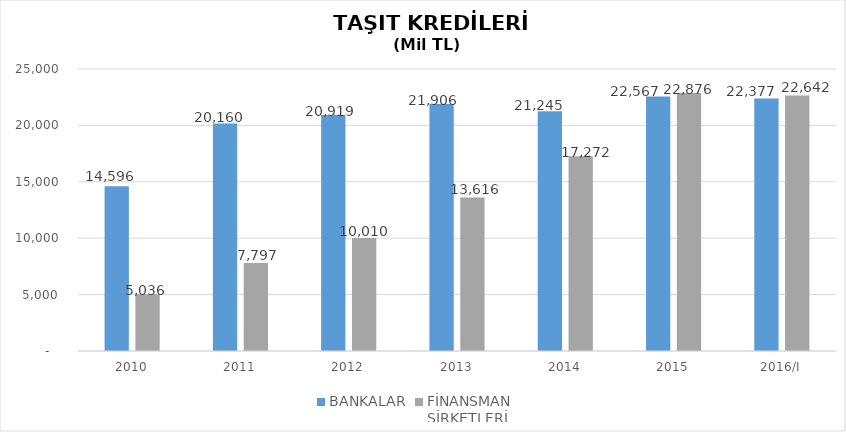
| Category | BANKALAR | FİNANSMAN 
ŞİRKETLERİ |
|---|---|---|
| 2010 | 14596 | 5035.89 |
| 2011 | 20160 | 7796.854 |
| 2012 | 20919 | 10009.755 |
| 2013 | 21906 | 13616.036 |
| 2014 | 21245 | 17271.844 |
| 2015 | 22567 | 22875.563 |
| 2016/I | 22377 | 22642.006 |